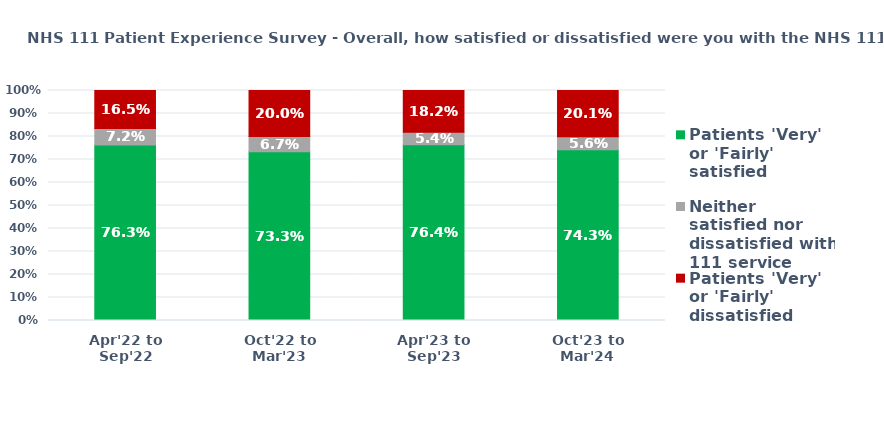
| Category | Patients 'Very' or 'Fairly' satisfied | Neither satisfied nor dissatisfied with 111 service | Patients 'Very' or 'Fairly' dissatisfied |
|---|---|---|---|
| Apr'22 to Sep'22 | 0.763 | 0.072 | 0.165 |
| Oct'22 to Mar'23 | 0.733 | 0.067 | 0.2 |
| Apr'23 to Sep'23 | 0.764 | 0.054 | 0.182 |
| Oct'23 to Mar'24 | 0.743 | 0.056 | 0.201 |